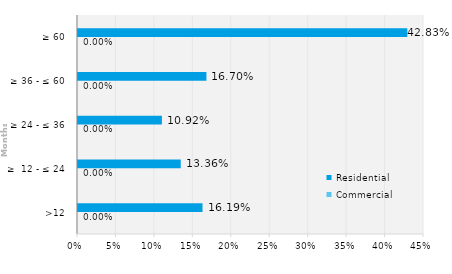
| Category | Commercial | Residential |
|---|---|---|
| >12 | 0 | 0.162 |
| ≥  12 - ≤ 24 | 0 | 0.134 |
| ≥ 24 - ≤ 36 | 0 | 0.109 |
| ≥ 36 - ≤ 60 | 0 | 0.167 |
| ≥ 60 | 0 | 0.428 |